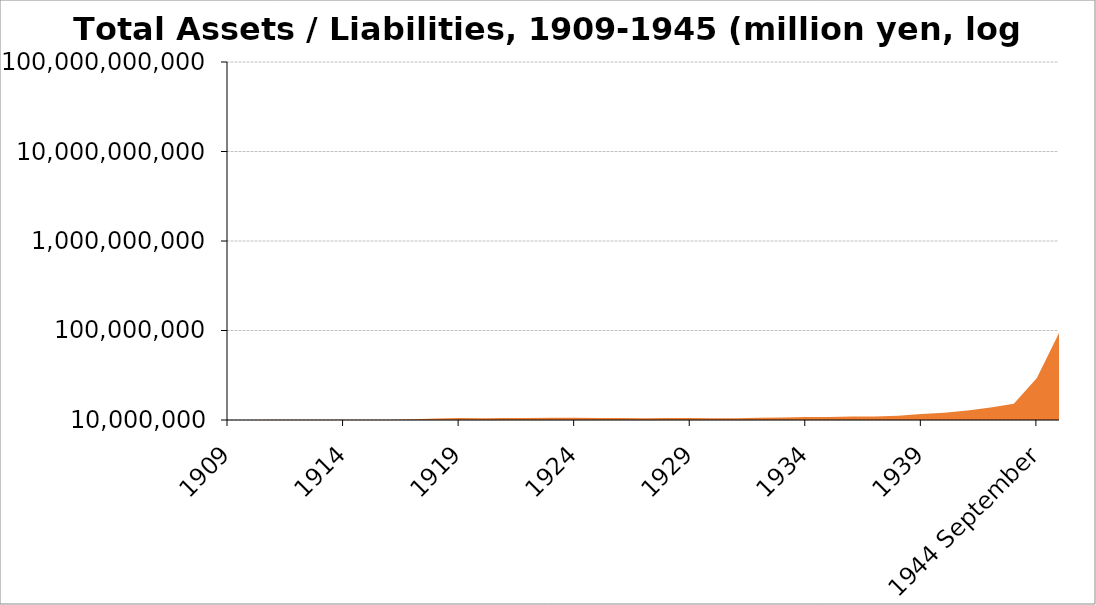
| Category | Total Asset and Liability change |
|---|---|
| 1909 | 40376477 |
| 1910 | 43684032 |
| 1911 | 46417294 |
| 1912 | 55105385 |
| 1913 | 62155042 |
| 1914 | 57799694 |
| 1915 | 70144220 |
| 1916 | 98955682 |
| 1917 | 191161717 |
| 1918 | 413061135 |
| 1919 | 590067364 |
| 1920 | 507038150 |
| 1921 | 600701745 |
| 1922 | 565001470 |
| 1923 | 660207078 |
| 1924 | 644225523 |
| 1925 | 547008511 |
| 1926 | 560511089 |
| 1927 | 527395946 |
| 1928 | 559939211 |
| 1929 | 559231347 |
| 1930 | 512604347 |
| 1931 | 532252863 |
| 1932 | 633301141 |
| 1933 | 717100006 |
| 1934 | 835628336 |
| 1935 | 876670698 |
| 1936 | 999023256 |
| 1937 | 976170659 |
| 1938 | 1173230463 |
| 1939 | 1664206565 |
| 1940 | 2053356481 |
| 1941 | 2659573129 |
| 1942 | 3533474108 |
| 1943 September | 4514823742 |
| 1944 September | 11716058713 |
| 1945 March | 24892123475 |